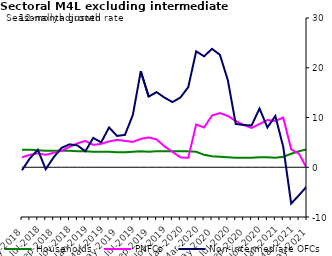
| Category | zero | Households | PNFCs | Non-intermediate OFCs |
|---|---|---|---|---|
| May-2018 | 0 | 3.5 | 2 | -0.6 |
| Jun-2018 | 0 | 3.5 | 2.5 | 1.8 |
| Jul-2018 | 0 | 3.4 | 2.8 | 3.5 |
| Aug-2018 | 0 | 3.3 | 2.5 | -0.4 |
| Sep-2018 | 0 | 3.3 | 2.9 | 2 |
| Oct-2018 | 0 | 3.3 | 3.3 | 3.9 |
| Nov-2018 | 0 | 3.3 | 4.1 | 4.6 |
| Dec-2018 | 0 | 3.2 | 4.8 | 4.4 |
| Jan-2019 | 0 | 3.2 | 5.3 | 3.2 |
| Feb-2019 | 0 | 3.1 | 4.5 | 5.9 |
| Mar-2019 | 0 | 3.1 | 4.7 | 5 |
| Apr-2019 | 0 | 3.1 | 5.2 | 8 |
| May-2019 | 0 | 3 | 5.5 | 6.3 |
| Jun-2019 | 0 | 3 | 5.3 | 6.5 |
| Jul-2019 | 0 | 3.1 | 5.1 | 10.5 |
| Aug-2019 | 0 | 3.2 | 5.7 | 19.3 |
| Sep-2019 | 0 | 3.1 | 6 | 14.2 |
| Oct-2019 | 0 | 3.2 | 5.6 | 15.1 |
| Nov-2019 | 0 | 3.2 | 4.2 | 14 |
| Dec-2019 | 0 | 3.2 | 3.1 | 13.1 |
| Jan-2020 | 0 | 3.2 | 2 | 14 |
| Feb-2020 | 0 | 3.2 | 1.9 | 16.1 |
| Mar-2020 | 0 | 3.1 | 8.6 | 23.3 |
| Apr-2020 | 0 | 2.5 | 8 | 22.3 |
| May-2020 | 0 | 2.2 | 10.4 | 23.8 |
| Jun-2020 | 0 | 2.1 | 10.9 | 22.6 |
| Jul-2020 | 0 | 2 | 10.3 | 17.5 |
| Aug-2020 | 0 | 1.9 | 9.3 | 8.7 |
| Sep-2020 | 0 | 1.9 | 8.5 | 8.5 |
| Oct-2020 | 0 | 1.9 | 7.9 | 8.4 |
| Nov-2020 | 0 | 2 | 8.7 | 11.8 |
| Dec-2020 | 0 | 2 | 9.5 | 8 |
| Jan-2021 | 0 | 1.9 | 9.3 | 10.3 |
| Feb-2021 | 0 | 2.1 | 10 | 4.1 |
| Mar-2021 | 0 | 2.7 | 3.6 | -7.3 |
| Apr-2021 | 0 | 3.2 | 2.7 | -5.6 |
| May-2021 | 0 | 3.6 | -0.3 | -3.8 |